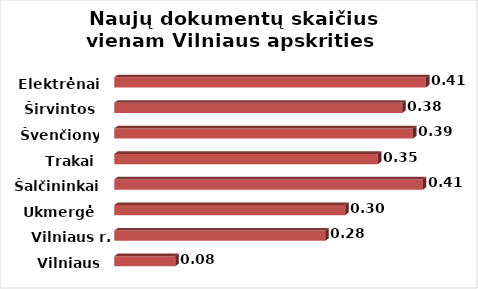
| Category | Series 0 |
|---|---|
| Vilniaus m. | 0.08 |
| Vilniaus r. | 0.277 |
| Ukmergė | 0.303 |
| Šalčininkai | 0.405 |
| Trakai | 0.346 |
| Švenčionys | 0.392 |
| Širvintos | 0.378 |
| Elektrėnai | 0.409 |